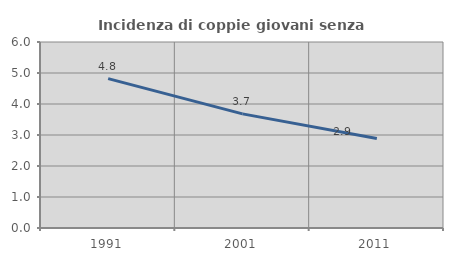
| Category | Incidenza di coppie giovani senza figli |
|---|---|
| 1991.0 | 4.819 |
| 2001.0 | 3.681 |
| 2011.0 | 2.89 |